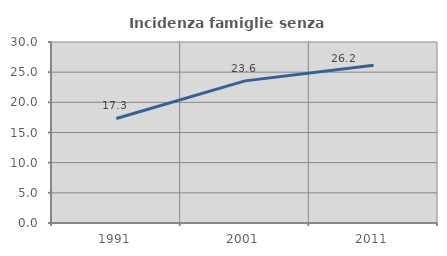
| Category | Incidenza famiglie senza nuclei |
|---|---|
| 1991.0 | 17.331 |
| 2001.0 | 23.556 |
| 2011.0 | 26.161 |